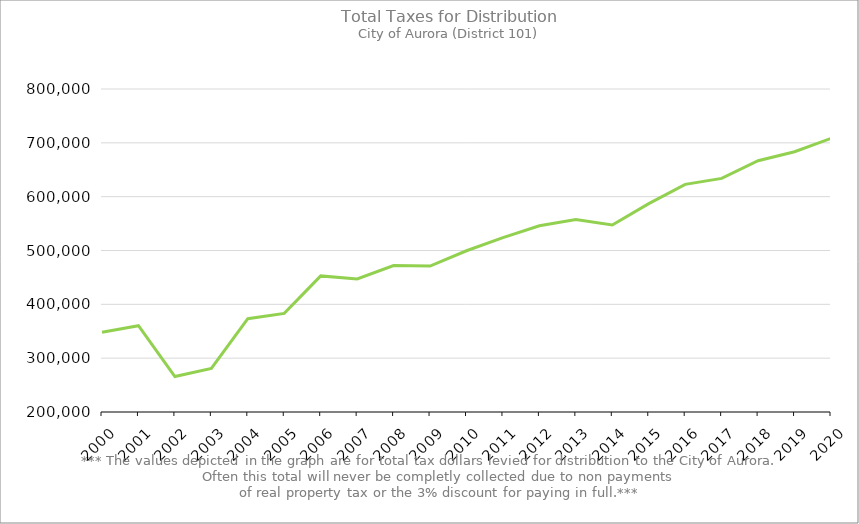
| Category | Series 0 |
|---|---|
| 2000.0 | 348217.42 |
| 2001.0 | 360269.09 |
| 2002.0 | 265857.31 |
| 2003.0 | 281101.38 |
| 2004.0 | 373277.59 |
| 2005.0 | 383209.36 |
| 2006.0 | 452843.45 |
| 2007.0 | 447004.46 |
| 2008.0 | 472001.11 |
| 2009.0 | 471030.8 |
| 2010.0 | 499540.61 |
| 2011.0 | 524028.03 |
| 2012.0 | 545846.26 |
| 2013.0 | 557721.95 |
| 2014.0 | 547457.36 |
| 2015.0 | 586972.35 |
| 2016.0 | 622888.66 |
| 2017.0 | 633908.19 |
| 2018.0 | 666677.09 |
| 2019.0 | 683481.34 |
| 2020.0 | 708309.02 |